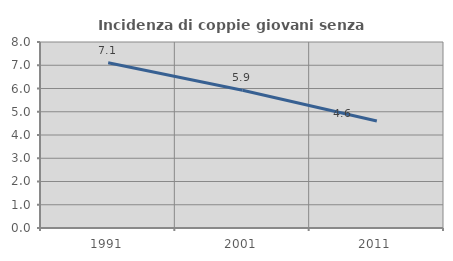
| Category | Incidenza di coppie giovani senza figli |
|---|---|
| 1991.0 | 7.111 |
| 2001.0 | 5.925 |
| 2011.0 | 4.604 |